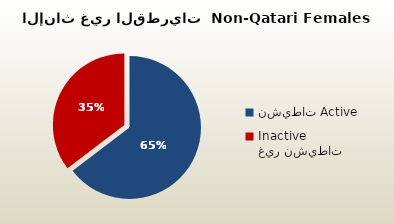
| Category | الاناث غير القطريات  Non-Qatari Females |
|---|---|
| نشيطات Active | 216120 |
| غير نشيطات Inactive | 118259 |